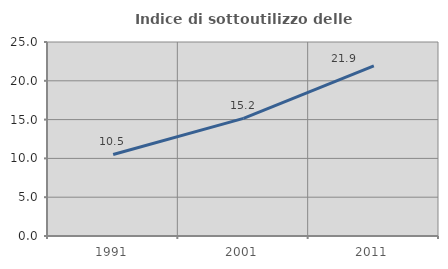
| Category | Indice di sottoutilizzo delle abitazioni  |
|---|---|
| 1991.0 | 10.506 |
| 2001.0 | 15.164 |
| 2011.0 | 21.922 |